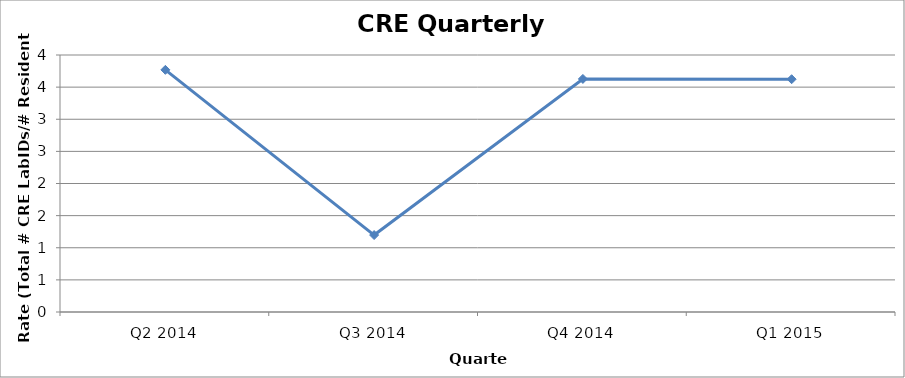
| Category | Series 0 |
|---|---|
| Q2 2014 | 3.769 |
| Q3 2014 | 1.198 |
| Q4 2014 | 3.628 |
| Q1 2015 | 3.623 |